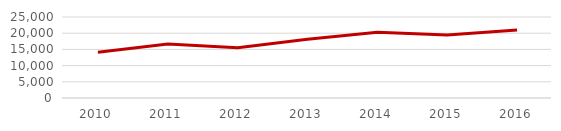
| Category | Gasto Total del Estado por Habitante  |
|---|---|
| 2010.0 | 14121.64 |
| 2011.0 | 16628.65 |
| 2012.0 | 15511.121 |
| 2013.0 | 18099.763 |
| 2014.0 | 20323.165 |
| 2015.0 | 19430.043 |
| 2016.0 | 20977.06 |